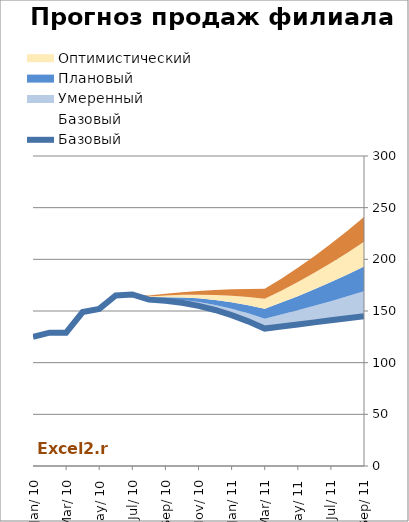
| Category | Базовый |
|---|---|
| 2010-01-01 | 125 |
| 2010-02-01 | 129 |
| 2010-03-01 | 129 |
| 2010-04-01 | 149 |
| 2010-05-01 | 152 |
| 2010-06-01 | 165 |
| 2010-07-01 | 166 |
| 2010-08-01 | 161 |
| 2010-09-01 | 160 |
| 2010-10-01 | 158 |
| 2010-11-01 | 155 |
| 2010-12-01 | 151 |
| 2011-01-01 | 146 |
| 2011-02-01 | 140 |
| 2011-03-01 | 133 |
| 2011-04-01 | 135 |
| 2011-05-01 | 137 |
| 2011-06-01 | 139 |
| 2011-07-01 | 141 |
| 2011-08-01 | 143 |
| 2011-09-01 | 145 |